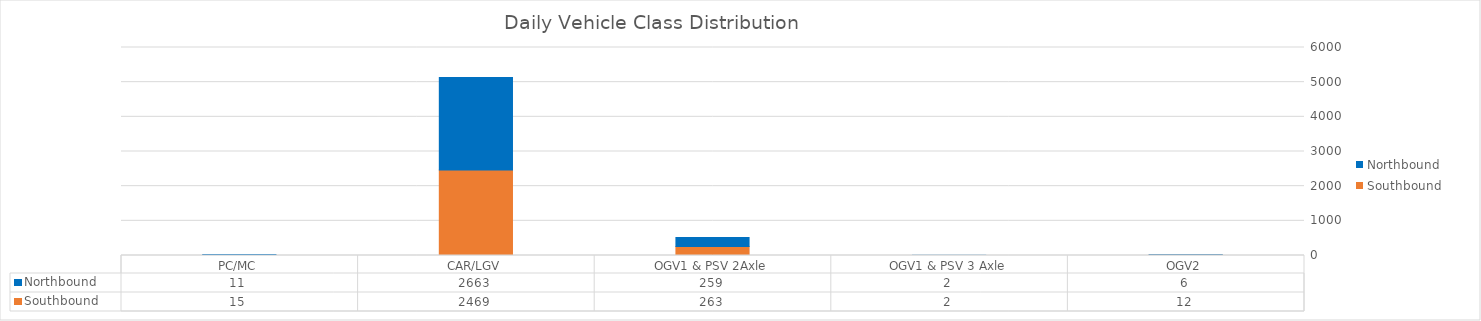
| Category | Southbound | Northbound |
|---|---|---|
| PC/MC | 15 | 11 |
| CAR/LGV | 2468.6 | 2663.4 |
| OGV1 & PSV 2Axle | 263 | 258.6 |
| OGV1 & PSV 3 Axle | 2 | 2.4 |
| OGV2 | 11.8 | 6.4 |